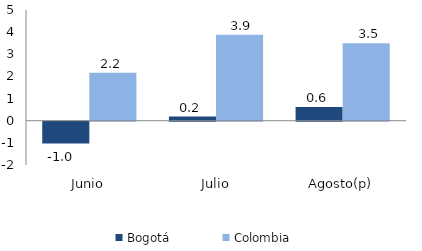
| Category | Bogotá | Colombia |
|---|---|---|
| Junio | -0.985 | 2.168 |
| Julio | 0.188 | 3.883 |
| Agosto(p) | 0.625 | 3.499 |